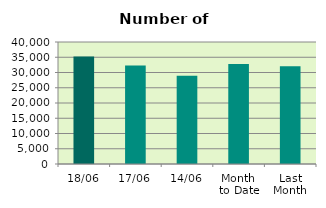
| Category | Series 0 |
|---|---|
| 18/06 | 35214 |
| 17/06 | 32266 |
| 14/06 | 28948 |
| Month 
to Date | 32782.833 |
| Last
Month | 32020.364 |